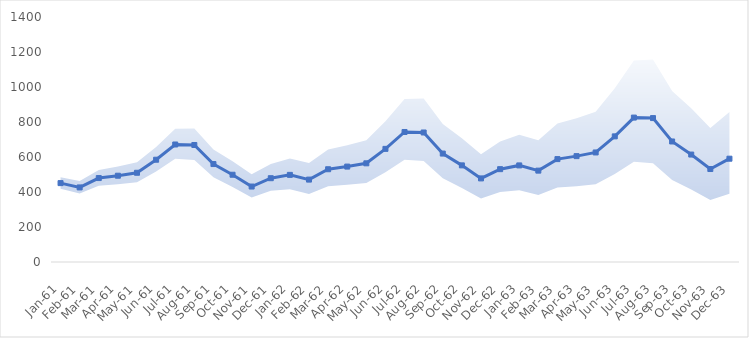
| Category | Series 0 |
|---|---|
| 1961-01-31 | 450.726 |
| 1961-02-28 | 426.107 |
| 1961-03-31 | 479.561 |
| 1961-04-30 | 493.093 |
| 1961-05-31 | 509.89 |
| 1961-06-30 | 584.442 |
| 1961-07-31 | 671.433 |
| 1961-08-31 | 668.655 |
| 1961-09-30 | 559.644 |
| 1961-10-31 | 498.624 |
| 1961-11-30 | 431.2 |
| 1961-12-31 | 478.833 |
| 1962-01-31 | 497.946 |
| 1962-02-28 | 470.871 |
| 1962-03-31 | 530.079 |
| 1962-04-30 | 545.179 |
| 1962-05-31 | 563.897 |
| 1962-06-30 | 646.515 |
| 1962-07-31 | 742.939 |
| 1962-08-31 | 740.058 |
| 1962-09-30 | 619.568 |
| 1962-10-31 | 552.158 |
| 1962-11-30 | 477.621 |
| 1962-12-31 | 530.519 |
| 1963-01-31 | 551.927 |
| 1963-02-28 | 522.102 |
| 1963-03-31 | 587.962 |
| 1963-04-30 | 604.925 |
| 1963-05-31 | 625.918 |
| 1963-06-30 | 717.878 |
| 1963-07-31 | 825.239 |
| 1963-08-31 | 822.331 |
| 1963-09-30 | 688.691 |
| 1963-10-31 | 613.979 |
| 1963-11-30 | 531.285 |
| 1963-12-31 | 590.337 |